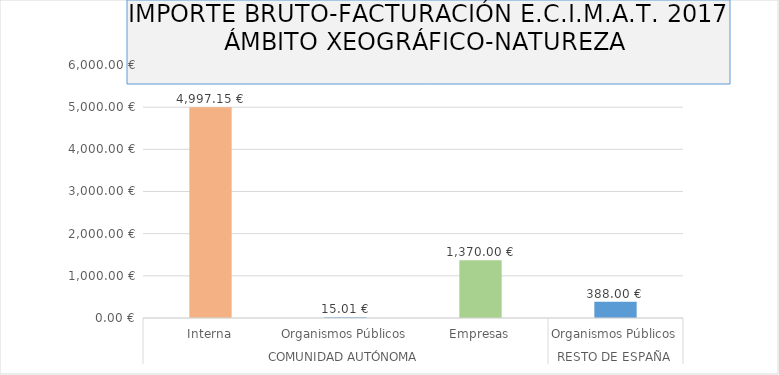
| Category | Series 0 |
|---|---|
| 0 | 4997.15 |
| 1 | 15.01 |
| 2 | 1370 |
| 3 | 388 |